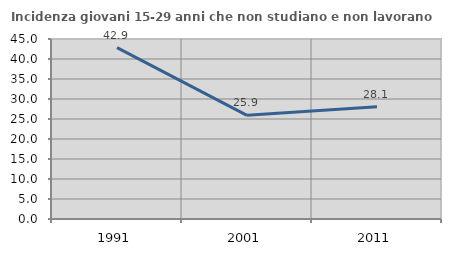
| Category | Incidenza giovani 15-29 anni che non studiano e non lavorano  |
|---|---|
| 1991.0 | 42.857 |
| 2001.0 | 25.926 |
| 2011.0 | 28.061 |